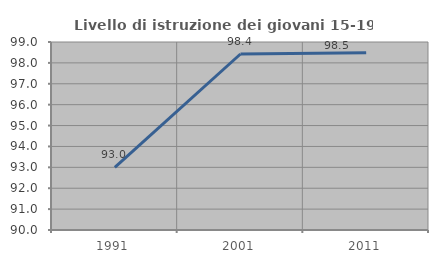
| Category | Livello di istruzione dei giovani 15-19 anni |
|---|---|
| 1991.0 | 92.994 |
| 2001.0 | 98.425 |
| 2011.0 | 98.485 |